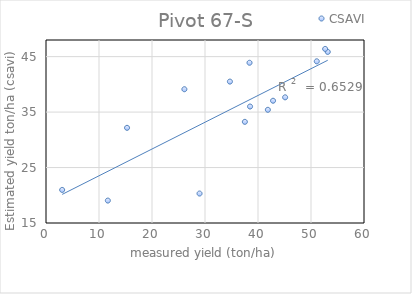
| Category | CSAVI |
|---|---|
| 42.84 | 37.046 |
| 38.400001 | 43.894 |
| 26.11 | 39.121 |
| 11.67 | 19.043 |
| 37.52 | 33.241 |
| 41.86 | 35.411 |
| 3.049999 | 20.964 |
| 15.289999 | 32.162 |
| 38.5 | 36.002 |
| 45.119998 | 37.661 |
| 34.7 | 40.499 |
| 53.159999 | 45.85 |
| 52.669998 | 46.389 |
| 51.09 | 44.154 |
| 28.969999 | 20.313 |